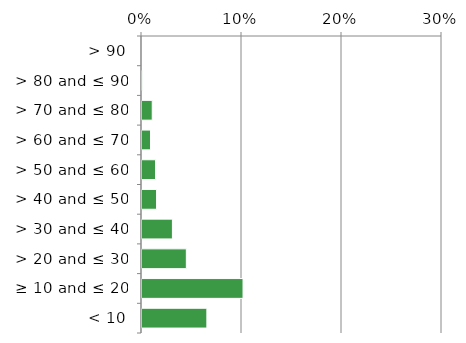
| Category | Non native |
|---|---|
|  < 10 | 0.066 |
|  ≥ 10 and ≤ 20 | 0.102 |
|  > 20 and ≤ 30 | 0.045 |
|  > 30 and ≤ 40 | 0.031 |
|  > 40 and ≤ 50 | 0.016 |
|  > 50 and ≤ 60 | 0.015 |
|  > 60 and ≤ 70 | 0.01 |
|  > 70 and ≤ 80 | 0.011 |
|  > 80 and ≤ 90 | 0.001 |
|  > 90 | 0 |